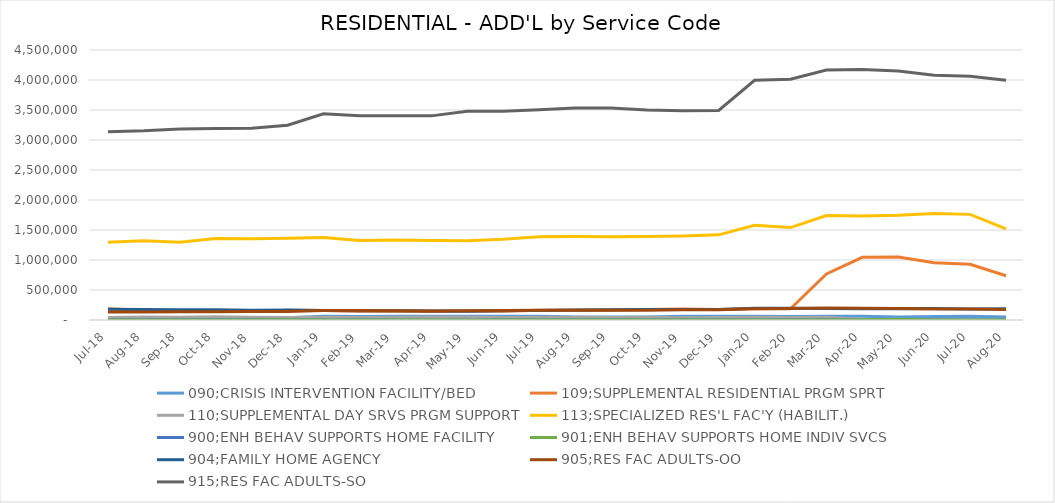
| Category | 090;CRISIS INTERVENTION FACILITY/BED | 109;SUPPLEMENTAL RESIDENTIAL PRGM SPRT | 110;SUPPLEMENTAL DAY SRVS PRGM SUPPORT | 113;SPECIALIZED RES'L FAC'Y (HABILIT.) | 900;ENH BEHAV SUPPORTS HOME FACILITY | 901;ENH BEHAV SUPPORTS HOME INDIV SVCS | 904;FAMILY HOME AGENCY | 905;RES FAC ADULTS-OO | 915;RES FAC ADULTS-SO |
|---|---|---|---|---|---|---|---|---|---|
| Jul-18 | 37328.03 | 189419.34 | 42056.71 | 1295846.43 | 0 | 0 | 180268.55 | 134343.04 | 3137672.89 |
| Aug-18 | 37328.03 | 162019.01 | 49309.02 | 1321969.46 | 0 | 0 | 174932.73 | 132167.41 | 3152402.04 |
| Sep-18 | 36123.9 | 145858.19 | 46646.09 | 1294366.03 | 0 | 0 | 170391.16 | 135526.87 | 3183213.81 |
| Oct-18 | 37328.03 | 140115.86 | 52865.42 | 1356898.52 | 0 | 0 | 171120.56 | 136435.02 | 3190868.94 |
| Nov-18 | 36123.9 | 143149.57 | 47476.15 | 1355040.19 | 0 | 0 | 161031.25 | 141001.19 | 3195312.31 |
| Dec-18 | 37328.03 | 161360.7 | 41647.41 | 1364472.64 | 0 | 0 | 166785.26 | 142098.28 | 3247431.46 |
| Jan-19 | 60525.89 | 158577.01 | 47543.48 | 1373222.3 | 0 | 0 | 157506.27 | 158809.74 | 3436867.4 |
| Feb-19 | 56917.28 | 144642.4 | 42908.38 | 1324060.94 | 0 | 0 | 153763.83 | 157320.54 | 3403926.09 |
| Mar-19 | 63015.56 | 150269.96 | 47005.22 | 1332585.16 | 0 | 0 | 153429.8 | 154888.42 | 3403369.55 |
| Apr-19 | 60982.8 | 142621.91 | 50110.91 | 1324031.69 | 0 | 0 | 149389.36 | 150695.92 | 3402208.34 |
| May-19 | 63015.56 | 148781.34 | 49175.25 | 1322730.62 | 0 | 0 | 145493.06 | 156081.91 | 3480161.66 |
| Jun-19 | 60982.8 | 144097.5 | 42875.95 | 1344436.16 | 0 | 0 | 155063.92 | 159698.35 | 3478783.54 |
| Jul-19 | 63015.56 | 163680.65 | 45191.73 | 1388660.64 | 0 | 0 | 160417.12 | 163374.17 | 3503226.48 |
| Aug-19 | 49747.25 | 163917.72 | 45369.46 | 1389825.36 | 0 | 0 | 166057.1 | 163374.17 | 3531530.18 |
| Sep-19 | 48142.5 | 166065.85 | 40128.04 | 1386155.47 | 0 | 0 | 169514.97 | 163374.17 | 3534465.09 |
| Oct-19 | 50175.26 | 175617.32 | 44455.4 | 1392628.85 | 0 | 0 | 174745.9 | 163374.17 | 3499023.49 |
| Nov-19 | 60982.8 | 182883.48 | 38583.72 | 1401266.61 | 0 | 0 | 175677.02 | 168895.17 | 3488092.65 |
| Dec-19 | 63015.56 | 173756.24 | 40407.1 | 1419046.68 | 0 | 0 | 173535.5 | 168895.17 | 3492673.62 |
| Jan-20 | 63015.56 | 191408.16 | 45174.57 | 1579811.14 | 0 | 0 | 196666.87 | 189021.97 | 3995908.48 |
| Feb-20 | 58950.04 | 187847.38 | 41662.7 | 1540154.11 | 0 | 0 | 197561.42 | 190638.54 | 4014283.25 |
| Mar-20 | 63015.56 | 767938.44 | 46480.32 | 1741997.24 | 0 | 0 | 192909.6 | 198428.54 | 4166279.96 |
| Apr-20 | 60982.8 | 1044487.09 | 10136.06 | 1734381.38 | 907.6 | 2095.98 | 189478.26 | 197829.18 | 4176708.29 |
| May-20 | 49747.25 | 1049097.06 | 6883.1 | 1747767.57 | 5445.6 | 12575.88 | 188063.62 | 189633.37 | 4150285.99 |
| Jun-20 | 58582.5 | 954693.2 | 4271.2 | 1776989.99 | 0 | 0 | 189992.05 | 181348.02 | 4077640.56 |
| Jul-20 | 63667.25 | 927413.45 | 1553.48 | 1760504.85 | 0 | 0 | 183985.99 | 181348.02 | 4064398.77 |
| Aug-20 | 49747.25 | 737836.07 | 1479.5 | 1517595.79 | 0 | 0 | 185452.64 | 174962.04 | 3996940.34 |